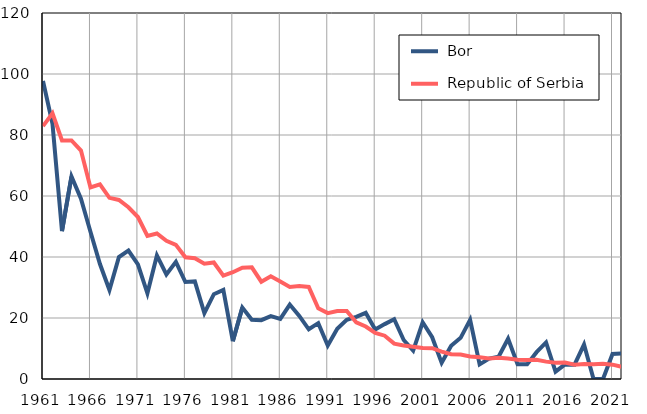
| Category |  Bor |  Republic of Serbia |
|---|---|---|
| 1961.0 | 97.7 | 82.9 |
| 1962.0 | 83.7 | 87.1 |
| 1963.0 | 48.5 | 78.2 |
| 1964.0 | 66.4 | 78.2 |
| 1965.0 | 59.1 | 74.9 |
| 1966.0 | 48.3 | 62.8 |
| 1967.0 | 37.7 | 63.8 |
| 1968.0 | 29.2 | 59.4 |
| 1969.0 | 40 | 58.7 |
| 1970.0 | 42.1 | 56.3 |
| 1971.0 | 37.6 | 53.1 |
| 1972.0 | 28.1 | 46.9 |
| 1973.0 | 40.5 | 47.7 |
| 1974.0 | 34.3 | 45.3 |
| 1975.0 | 38.4 | 44 |
| 1976.0 | 31.8 | 39.9 |
| 1977.0 | 32 | 39.6 |
| 1978.0 | 21.6 | 37.8 |
| 1979.0 | 27.8 | 38.2 |
| 1980.0 | 29.2 | 33.9 |
| 1981.0 | 12.4 | 35 |
| 1982.0 | 23.4 | 36.5 |
| 1983.0 | 19.4 | 36.6 |
| 1984.0 | 19.3 | 31.9 |
| 1985.0 | 20.6 | 33.7 |
| 1986.0 | 19.7 | 32 |
| 1987.0 | 24.4 | 30.2 |
| 1988.0 | 20.7 | 30.5 |
| 1989.0 | 16.3 | 30.2 |
| 1990.0 | 18.3 | 23.2 |
| 1991.0 | 11 | 21.6 |
| 1992.0 | 16.5 | 22.3 |
| 1993.0 | 19.4 | 22.3 |
| 1994.0 | 20.4 | 18.6 |
| 1995.0 | 21.7 | 17.2 |
| 1996.0 | 16.2 | 15.1 |
| 1997.0 | 18 | 14.2 |
| 1998.0 | 19.6 | 11.6 |
| 1999.0 | 12.8 | 11 |
| 2000.0 | 9.3 | 10.6 |
| 2001.0 | 18.6 | 10.2 |
| 2002.0 | 13.7 | 10.1 |
| 2003.0 | 5.3 | 9 |
| 2004.0 | 10.9 | 8.1 |
| 2005.0 | 13.5 | 8 |
| 2006.0 | 19.4 | 7.4 |
| 2007.0 | 4.8 | 7.1 |
| 2008.0 | 6.7 | 6.7 |
| 2009.0 | 7.3 | 7 |
| 2010.0 | 13.2 | 6.7 |
| 2011.0 | 4.8 | 6.3 |
| 2012.0 | 4.8 | 6.2 |
| 2013.0 | 8.8 | 6.3 |
| 2014.0 | 12 | 5.7 |
| 2015.0 | 2.4 | 5.3 |
| 2016.0 | 4.8 | 5.4 |
| 2017.0 | 4.7 | 4.7 |
| 2018.0 | 11.3 | 4.9 |
| 2019.0 | 0 | 4.8 |
| 2020.0 | 0 | 5 |
| 2021.0 | 8.2 | 4.7 |
| 2022.0 | 8.4 | 4 |